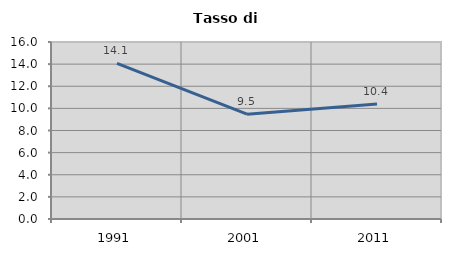
| Category | Tasso di disoccupazione   |
|---|---|
| 1991.0 | 14.059 |
| 2001.0 | 9.471 |
| 2011.0 | 10.397 |